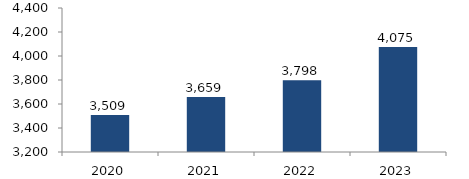
| Category | Bogotá |
|---|---|
| 2020.0 | 3509.001 |
| 2021.0 | 3659.342 |
| 2022.0 | 3798.228 |
| 2023.0 | 4075.011 |